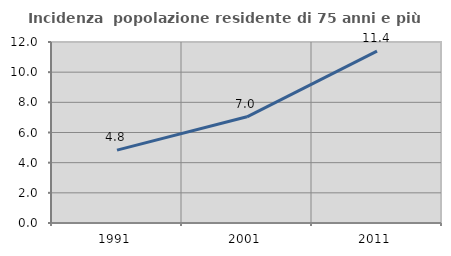
| Category | Incidenza  popolazione residente di 75 anni e più |
|---|---|
| 1991.0 | 4.83 |
| 2001.0 | 7.041 |
| 2011.0 | 11.391 |